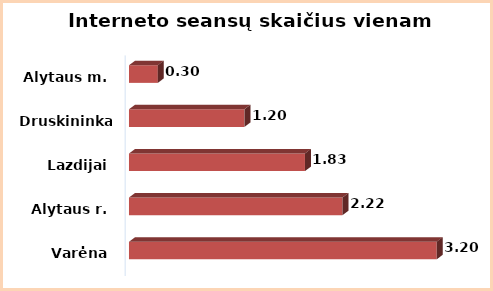
| Category | Series 0 |
|---|---|
| Varėna | 3.2 |
| Alytaus r. | 2.22 |
| Lazdijai | 1.83 |
| Druskininkai  | 1.2 |
| Alytaus m. | 0.3 |